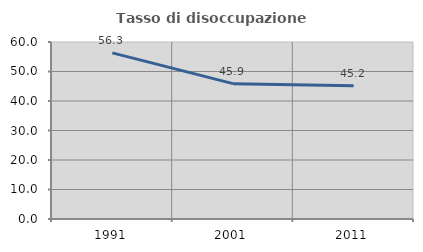
| Category | Tasso di disoccupazione giovanile  |
|---|---|
| 1991.0 | 56.329 |
| 2001.0 | 45.877 |
| 2011.0 | 45.174 |